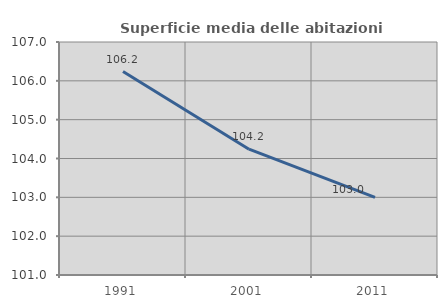
| Category | Superficie media delle abitazioni occupate |
|---|---|
| 1991.0 | 106.24 |
| 2001.0 | 104.239 |
| 2011.0 | 103 |